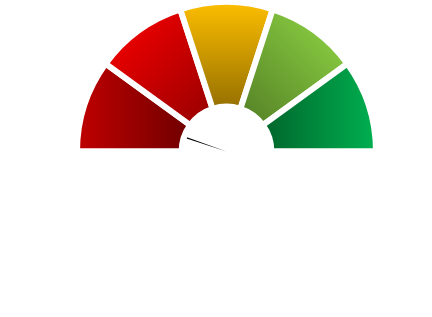
| Category | Series 1 |
|---|---|
| 0 | 0.1 |
| 1 | 0.01 |
| 2 | 1.89 |